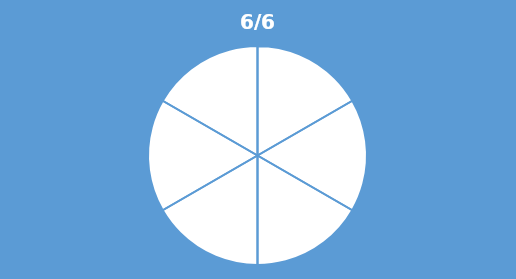
| Category | Series 0 |
|---|---|
| 0 | 0.167 |
| 1 | 0.167 |
| 2 | 0.167 |
| 3 | 0.167 |
| 4 | 0.167 |
| 5 | 0.167 |